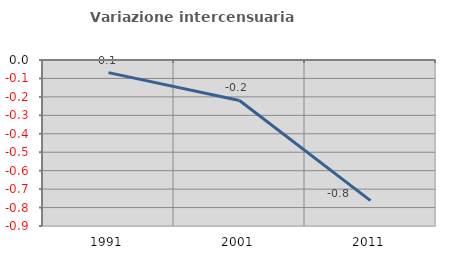
| Category | Variazione intercensuaria annua |
|---|---|
| 1991.0 | -0.068 |
| 2001.0 | -0.22 |
| 2011.0 | -0.762 |